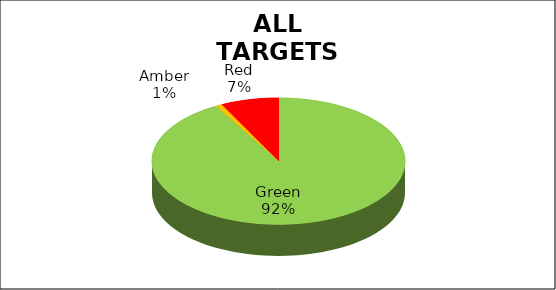
| Category | Series 0 |
|---|---|
| Green | 0.918 |
| Amber | 0.008 |
| Red | 0.074 |